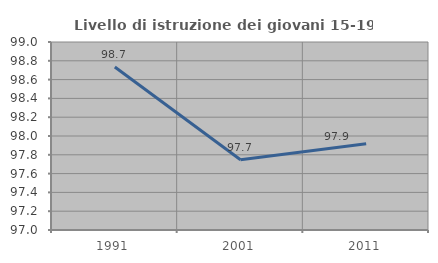
| Category | Livello di istruzione dei giovani 15-19 anni |
|---|---|
| 1991.0 | 98.734 |
| 2001.0 | 97.748 |
| 2011.0 | 97.917 |